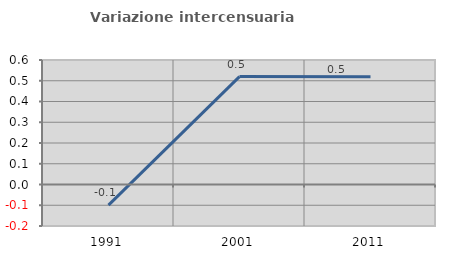
| Category | Variazione intercensuaria annua |
|---|---|
| 1991.0 | -0.099 |
| 2001.0 | 0.52 |
| 2011.0 | 0.519 |